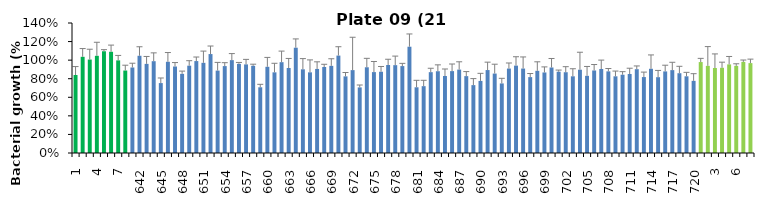
| Category | 21 h % |
|---|---|
| 1.0 | 0.84 |
| 2.0 | 1.036 |
| 3.0 | 1.006 |
| 4.0 | 1.047 |
| 5.0 | 1.096 |
| 6.0 | 1.09 |
| 7.0 | 0.998 |
| 8.0 | 0.888 |
| 641.0 | 0.921 |
| 642.0 | 1.047 |
| 643.0 | 0.96 |
| 644.0 | 0.989 |
| 645.0 | 0.753 |
| 646.0 | 0.982 |
| 647.0 | 0.932 |
| 648.0 | 0.852 |
| 649.0 | 0.94 |
| 650.0 | 0.99 |
| 651.0 | 0.971 |
| 652.0 | 1.065 |
| 653.0 | 0.888 |
| 654.0 | 0.936 |
| 655.0 | 1 |
| 656.0 | 0.96 |
| 657.0 | 0.954 |
| 658.0 | 0.939 |
| 659.0 | 0.708 |
| 660.0 | 0.928 |
| 661.0 | 0.869 |
| 662.0 | 0.978 |
| 663.0 | 0.915 |
| 664.0 | 1.134 |
| 665.0 | 0.901 |
| 666.0 | 0.869 |
| 667.0 | 0.905 |
| 668.0 | 0.926 |
| 669.0 | 0.938 |
| 670.0 | 1.049 |
| 671.0 | 0.825 |
| 672.0 | 0.893 |
| 673.0 | 0.707 |
| 674.0 | 0.923 |
| 675.0 | 0.871 |
| 676.0 | 0.875 |
| 677.0 | 0.948 |
| 678.0 | 0.946 |
| 679.0 | 0.936 |
| 680.0 | 1.145 |
| 681.0 | 0.708 |
| 682.0 | 0.72 |
| 683.0 | 0.871 |
| 684.0 | 0.881 |
| 685.0 | 0.829 |
| 686.0 | 0.882 |
| 687.0 | 0.898 |
| 688.0 | 0.828 |
| 689.0 | 0.731 |
| 690.0 | 0.776 |
| 691.0 | 0.893 |
| 692.0 | 0.856 |
| 693.0 | 0.749 |
| 694.0 | 0.91 |
| 695.0 | 0.941 |
| 696.0 | 0.91 |
| 697.0 | 0.817 |
| 698.0 | 0.885 |
| 699.0 | 0.867 |
| 700.0 | 0.921 |
| 701.0 | 0.876 |
| 702.0 | 0.87 |
| 703.0 | 0.826 |
| 704.0 | 0.897 |
| 705.0 | 0.831 |
| 706.0 | 0.889 |
| 707.0 | 0.905 |
| 708.0 | 0.879 |
| 709.0 | 0.826 |
| 710.0 | 0.843 |
| 711.0 | 0.85 |
| 712.0 | 0.903 |
| 713.0 | 0.818 |
| 714.0 | 0.907 |
| 715.0 | 0.817 |
| 716.0 | 0.879 |
| 717.0 | 0.893 |
| 718.0 | 0.859 |
| 719.0 | 0.826 |
| 720.0 | 0.777 |
| 1.0 | 0.979 |
| 2.0 | 0.938 |
| 3.0 | 0.915 |
| 4.0 | 0.918 |
| 5.0 | 0.954 |
| 6.0 | 0.938 |
| 7.0 | 0.981 |
| 8.0 | 0.968 |